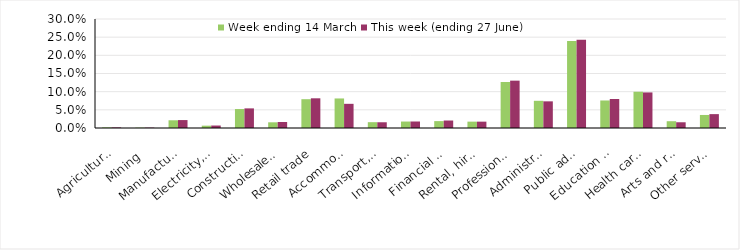
| Category | Week ending 14 March | This week (ending 27 June) |
|---|---|---|
| Agriculture, forestry and fishing | 0.002 | 0.002 |
| Mining | 0.001 | 0.001 |
| Manufacturing | 0.021 | 0.022 |
| Electricity, gas, water and waste services | 0.006 | 0.007 |
| Construction | 0.052 | 0.054 |
| Wholesale trade | 0.016 | 0.016 |
| Retail trade | 0.079 | 0.082 |
| Accommodation and food services | 0.081 | 0.067 |
| Transport, postal and warehousing | 0.016 | 0.016 |
| Information media and telecommunications | 0.018 | 0.018 |
| Financial and insurance services | 0.019 | 0.021 |
| Rental, hiring and real estate services | 0.018 | 0.017 |
| Professional, scientific and technical services | 0.127 | 0.13 |
| Administrative and support services | 0.075 | 0.073 |
| Public administration and safety | 0.239 | 0.243 |
| Education and training | 0.076 | 0.08 |
| Health care and social assistance | 0.1 | 0.098 |
| Arts and recreation services | 0.019 | 0.016 |
| Other services | 0.036 | 0.038 |